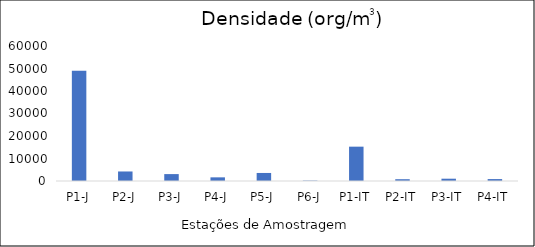
| Category | Series 0 |
|---|---|
| P1-J | 48950 |
| P2-J | 4235 |
| P3-J | 3070 |
| P4-J | 1625 |
| P5-J | 3570 |
| P6-J | 170 |
| P1-IT | 15260 |
| P2-IT | 795 |
| P3-IT | 1020 |
| P4-IT | 855 |